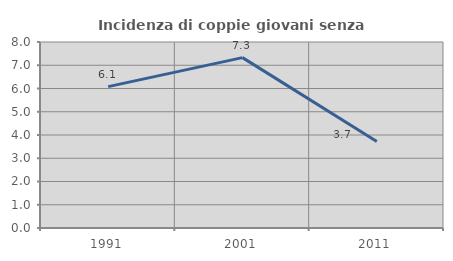
| Category | Incidenza di coppie giovani senza figli |
|---|---|
| 1991.0 | 6.082 |
| 2001.0 | 7.329 |
| 2011.0 | 3.717 |